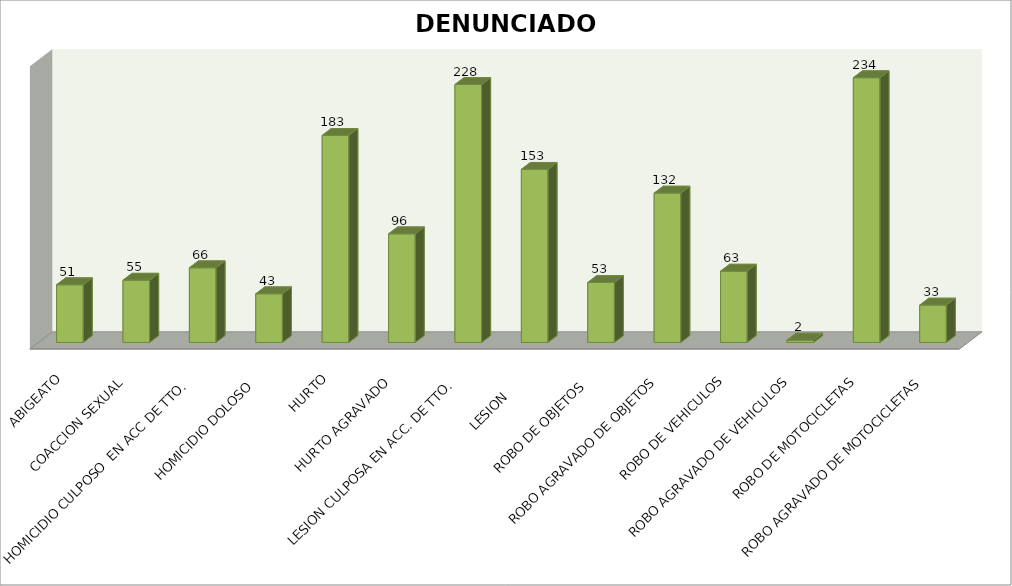
| Category | DENUNCIADOS |
|---|---|
| ABIGEATO | 51 |
| COACCION SEXUAL | 55 |
| HOMICIDIO CULPOSO  EN ACC DE TTO.  | 66 |
| HOMICIDIO DOLOSO  | 43 |
| HURTO | 183 |
| HURTO AGRAVADO | 96 |
| LESION CULPOSA EN ACC. DE TTO. | 228 |
| LESION      | 153 |
| ROBO DE OBJETOS  | 53 |
| ROBO AGRAVADO DE OBJETOS | 132 |
| ROBO DE VEHICULOS | 63 |
| ROBO AGRAVADO DE VEHICULOS | 2 |
| ROBO DE MOTOCICLETAS | 234 |
| ROBO AGRAVADO DE MOTOCICLETAS | 33 |